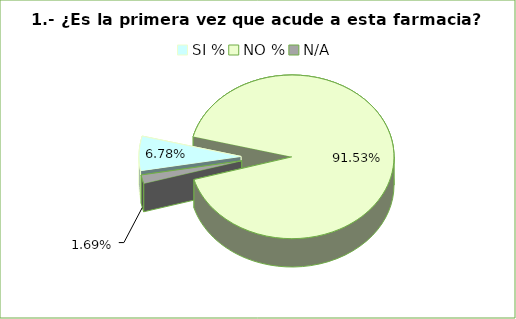
| Category | Series 0 |
|---|---|
| SI % | 0.068 |
| NO % | 0.915 |
| N/A | 0.017 |